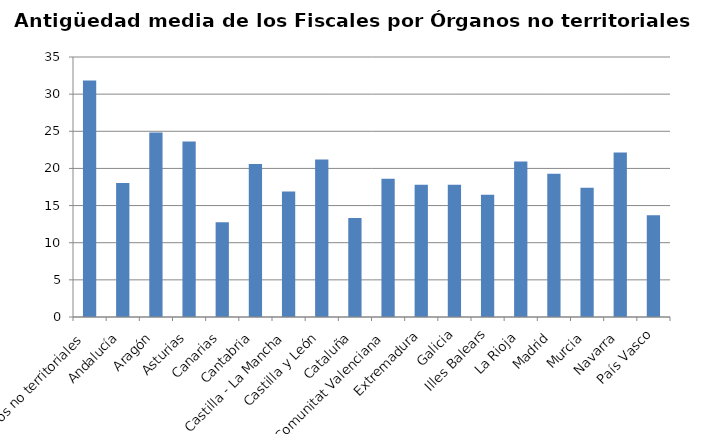
| Category | Series 0 |
|---|---|
| Órganos no territoriales | 31.85 |
| Andalucía | 18.03 |
| Aragón | 24.85 |
| Asturias | 23.63 |
| Canarias | 12.74 |
| Cantabria | 20.59 |
| Castilla - La Mancha | 16.91 |
| Castilla y León | 21.19 |
| Cataluña | 13.32 |
| Comunitat Valenciana | 18.6 |
| Extremadura | 17.81 |
| Galicia | 17.81 |
| Illes Balears | 16.47 |
| La Rioja | 20.92 |
| Madrid | 19.27 |
| Murcia | 17.4 |
| Navarra | 22.14 |
| País Vasco | 13.71 |